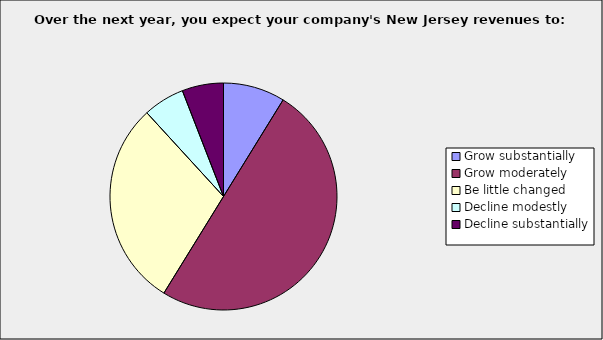
| Category | Series 0 |
|---|---|
| Grow substantially | 0.088 |
| Grow moderately | 0.5 |
| Be little changed | 0.294 |
| Decline modestly | 0.059 |
| Decline substantially | 0.059 |